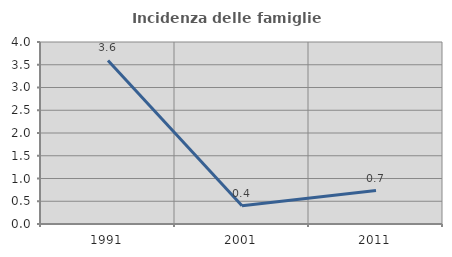
| Category | Incidenza delle famiglie numerose |
|---|---|
| 1991.0 | 3.596 |
| 2001.0 | 0.402 |
| 2011.0 | 0.736 |